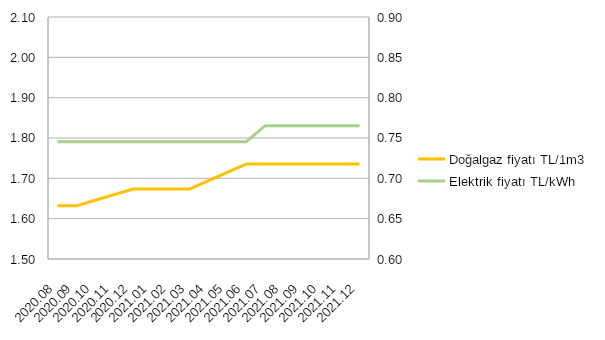
| Category | Doğalgaz fiyatı |
|---|---|
| 2020-08-05 | 1.632 |
| 2020-09-05 | 1.632 |
| 2020-10-06 | 1.646 |
| 2020-11-06 | 1.659 |
| 2020-12-07 | 1.673 |
| 2021-01-07 | 1.673 |
| 2021-02-07 | 1.673 |
| 2021-03-10 | 1.673 |
| 2021-04-10 | 1.694 |
| 2021-05-11 | 1.715 |
| 2021-06-11 | 1.736 |
| 2021-07-12 | 1.736 |
| 2021-08-12 | 1.736 |
| 2021-09-12 | 1.736 |
| 2021-10-13 | 1.736 |
| 2021-11-13 | 1.736 |
| 2021-12-14 | 1.736 |